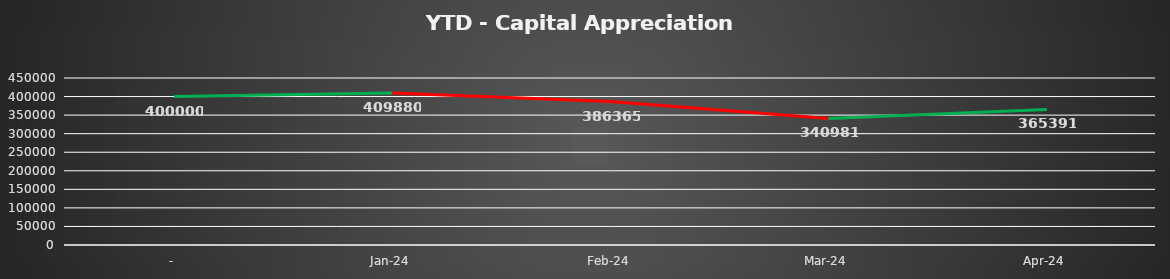
| Category | Capital Appreciation |
|---|---|
| - | 400000 |
| Jan-24 | 409880 |
| Feb-24 | 386365 |
| Mar-24 | 340981.25 |
| Apr-24 | 365391.25 |